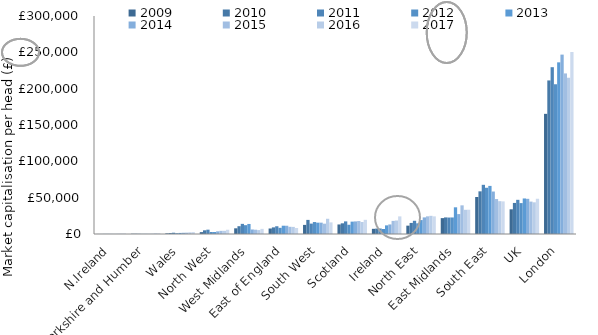
| Category | 2009 | 2010 | 2011 | 2012 | 2013 | 2014 | 2015 | 2016 | 2017 |
|---|---|---|---|---|---|---|---|---|---|
| N.Ireland | 82.208 | 109.196 | 178.06 | 195.852 | 170.004 | 167.06 | 285.235 | 444.756 | 629.175 |
| Yorkshire and Humber | 334.304 | 357.293 | 286.355 | 201.98 | 223.503 | 241.395 | 364.961 | 821.557 | 865.086 |
| Wales | 872.732 | 1299.922 | 1776.351 | 1096.79 | 1474.607 | 1698.192 | 1862.173 | 2228.309 | 2632.385 |
| North West | 2558.187 | 5077.887 | 5960.18 | 2724.752 | 2750.762 | 3653.409 | 4328.386 | 4401.782 | 5852.426 |
| West Midlands | 7830.441 | 10733.149 | 13947.283 | 12158.332 | 13829.411 | 6212.082 | 5905.994 | 5399.97 | 7068.16 |
| East of England | 7573.496 | 9117.241 | 10664.415 | 8492.758 | 11402.903 | 11370.238 | 9897.354 | 9771.329 | 8247.531 |
| South West | 12526.538 | 19405.761 | 14289.54 | 16458.003 | 15585.888 | 15611.598 | 14192.486 | 20955.061 | 15975.978 |
| Scotland | 13118.816 | 14710.552 | 17362.9 | 12707.949 | 17013.667 | 17320.901 | 17843.59 | 16541.257 | 19507.737 |
| Ireland | 7125.056 | 7478.425 | 7571.934 | 6851.546 | 11877.926 | 13145.815 | 18030.069 | 18554.1 | 24254.19 |
| North East | 11483.61 | 15226.345 | 18203.363 | 14684.5 | 19159.391 | 22840.536 | 24305.209 | 25003.998 | 24288.735 |
| East Midlands | 21851.524 | 22823.272 | 22637.736 | 22762.368 | 36734.862 | 27394.518 | 39437.015 | 33298.896 | 33408.106 |
| South East | 50911.385 | 58720.455 | 67675.993 | 63626.05 | 66187.909 | 58450.634 | 48103.783 | 45178.845 | 44885.231 |
| UK | 33991.35 | 42757.323 | 47035.972 | 42525.841 | 48913.45 | 48416.215 | 44575.252 | 43597.768 | 48501.638 |
| London | 165357.764 | 211325.715 | 229542.937 | 206239.166 | 236237.216 | 246860.873 | 220976.14 | 215163.905 | 250425.451 |